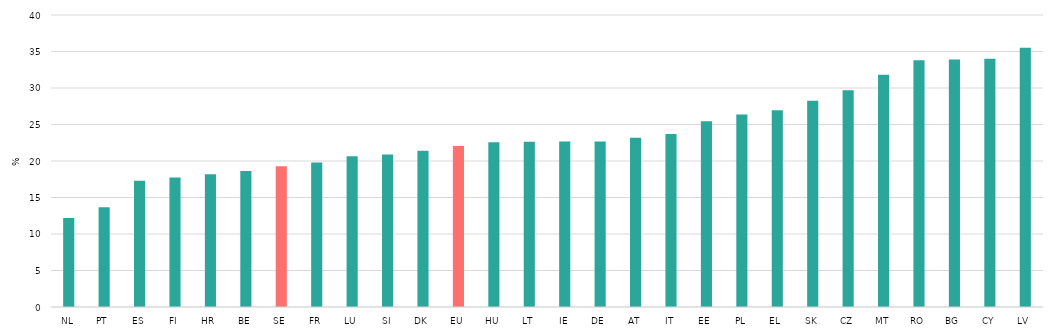
| Category | Series 0 |
|---|---|
| NL | 12.191 |
| PT | 13.673 |
| ES | 17.296 |
| FI | 17.725 |
| HR | 18.196 |
| BE | 18.632 |
| SE | 19.268 |
| FR | 19.79 |
| LU | 20.637 |
| SI | 20.874 |
| DK | 21.397 |
| EU | 22.07 |
| HU | 22.575 |
| LT | 22.635 |
| IE | 22.673 |
| DE | 22.677 |
| AT | 23.17 |
| IT | 23.703 |
| EE | 25.437 |
| PL | 26.36 |
| EL | 26.938 |
| SK | 28.27 |
| CZ | 29.699 |
| MT | 31.811 |
| RO | 33.791 |
| BG | 33.89 |
| CY | 34.006 |
| LV | 35.497 |